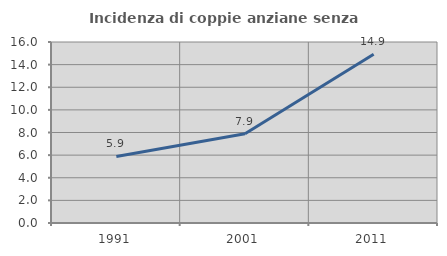
| Category | Incidenza di coppie anziane senza figli  |
|---|---|
| 1991.0 | 5.882 |
| 2001.0 | 7.895 |
| 2011.0 | 14.925 |